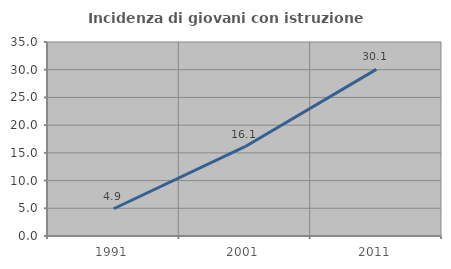
| Category | Incidenza di giovani con istruzione universitaria |
|---|---|
| 1991.0 | 4.914 |
| 2001.0 | 16.113 |
| 2011.0 | 30.058 |